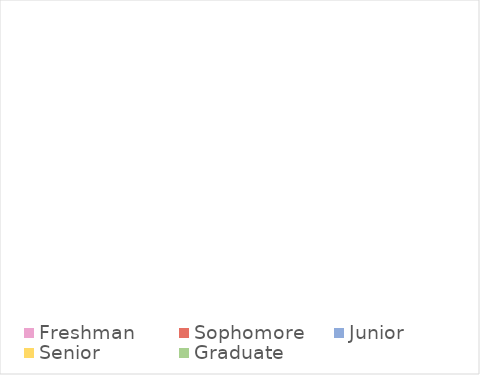
| Category | 0 |
|---|---|
| Freshman | 0 |
| Sophomore | 0 |
| Junior | 0 |
| Senior | 0 |
| Graduate | 0 |